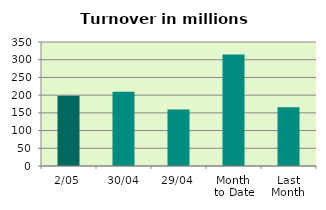
| Category | Series 0 |
|---|---|
| 2/05 | 198.061 |
| 30/04 | 209.926 |
| 29/04 | 159.358 |
| Month 
to Date | 314.52 |
| Last
Month | 165.638 |